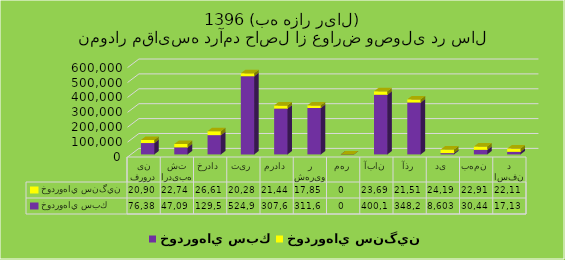
| Category | خودروهاي سبك  | خودروهاي سنگين  |
|---|---|---|
| فروردین | 76382 | 20903 |
| اردیبهشت | 47093 | 22748 |
| خرداد | 129565 | 26610 |
| تیر | 524907 | 20283 |
| مرداد | 307600 | 21448 |
| شهریور | 311638 | 17852 |
| مهر | 0 | 0 |
| آبان | 400177 | 23693 |
| آذر | 348272 | 21518 |
| دی | 8603 | 24192 |
| بهمن | 30449 | 22910 |
| اسفند | 17134 | 22110 |